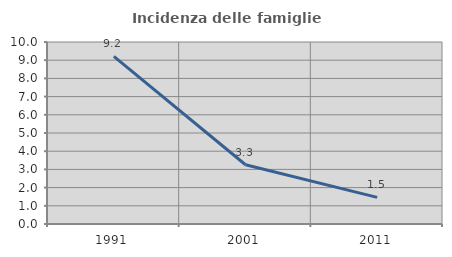
| Category | Incidenza delle famiglie numerose |
|---|---|
| 1991.0 | 9.209 |
| 2001.0 | 3.254 |
| 2011.0 | 1.465 |